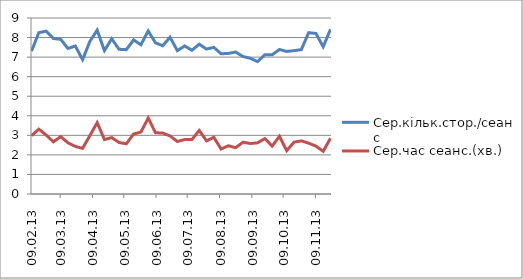
| Category | Сер.кільк.стор./сеанс | Сер.час сеанс.(хв.) |
|---|---|---|
| 2013-02-09 | 7.31 | 2.983 |
| 2013-02-16 | 8.25 | 3.317 |
| 2013-02-23 | 8.33 | 3.017 |
| 2013-03-02 | 7.95 | 2.667 |
| 2013-03-09 | 7.91 | 2.933 |
| 2013-03-16 | 7.44 | 2.617 |
| 2013-03-23 | 7.57 | 2.433 |
| 2013-03-30 | 6.87 | 2.333 |
| 2013-04-06 | 7.8 | 2.983 |
| 2013-04-13 | 8.38 | 3.65 |
| 2013-04-20 | 7.33 | 2.783 |
| 2013-04-27 | 7.94 | 2.883 |
| 2013-05-04 | 7.4 | 2.633 |
| 2013-05-11 | 7.38 | 2.567 |
| 2013-05-18 | 7.88 | 3.067 |
| 2013-05-25 | 7.63 | 3.167 |
| 2013-06-01 | 8.34 | 3.883 |
| 2013-06-08 | 7.73 | 3.133 |
| 2013-06-15 | 7.58 | 3.117 |
| 2013-06-22 | 8.02 | 2.967 |
| 2013-06-29 | 7.33 | 2.683 |
| 2013-07-06 | 7.57 | 2.783 |
| 2013-07-13 | 7.35 | 2.783 |
| 2013-07-20 | 7.66 | 3.25 |
| 2013-07-27 | 7.41 | 2.717 |
| 2013-08-03 | 7.5 | 2.9 |
| 2013-08-10 | 7.17 | 2.3 |
| 2013-08-17 | 7.19 | 2.467 |
| 2013-08-24 | 7.26 | 2.367 |
| 2013-08-31 | 7.03 | 2.65 |
| 2013-09-07 | 6.94 | 2.583 |
| 2013-09-14 | 6.77 | 2.617 |
| 2013-09-21 | 7.12 | 2.833 |
| 2013-09-28 | 7.12 | 2.45 |
| 2013-10-05 | 7.39 | 2.95 |
| 2013-10-12 | 7.29 | 2.217 |
| 2013-10-19 | 7.33 | 2.65 |
| 2013-10-26 | 7.38 | 2.717 |
| 2013-11-02 | 8.25 | 2.6 |
| 2013-11-09 | 8.21 | 2.45 |
| 2013-11-16 | 7.53 | 2.183 |
| 2013-11-23 | 8.42 | 2.85 |